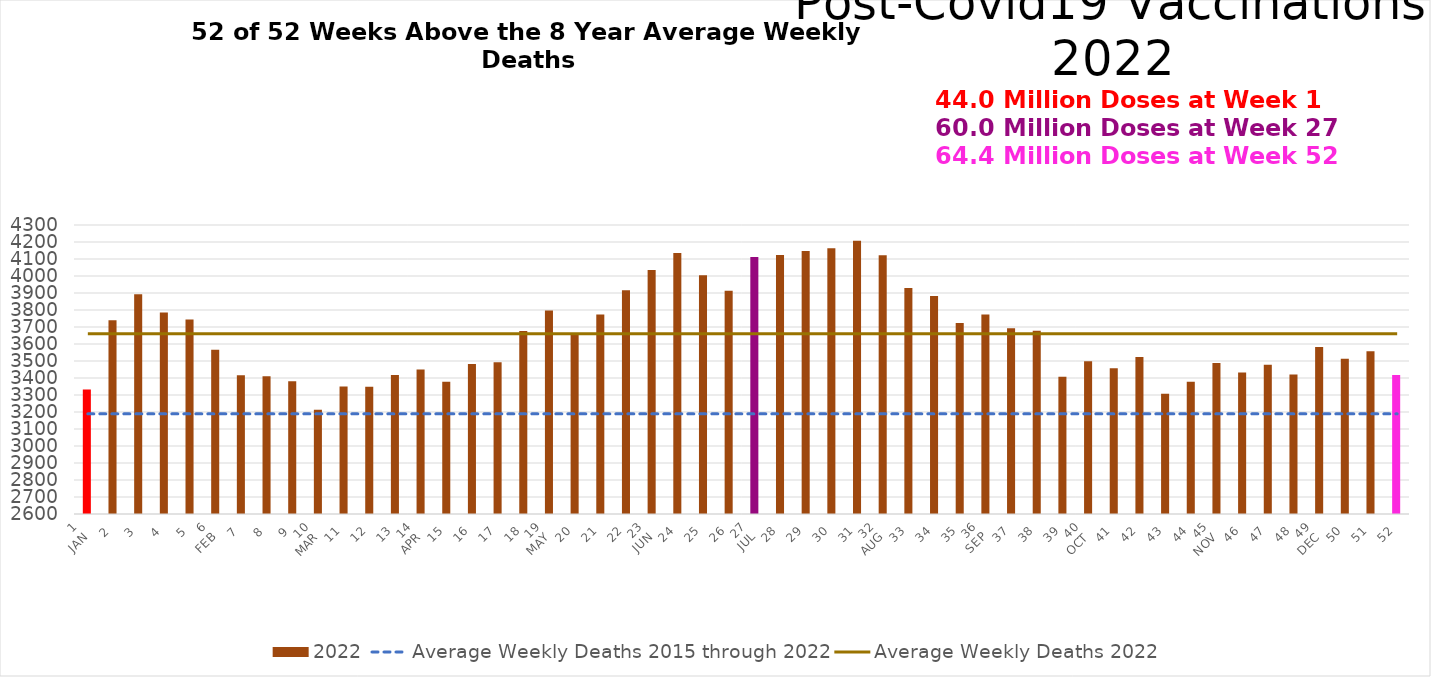
| Category | 2022 |
|---|---|
| 1
JAN | 3333 |
| 2 | 3739 |
| 3 | 3892 |
| 4 | 3786 |
| 5 | 3744 |
| 6
FEB | 3566 |
| 7 | 3416 |
| 8 | 3411 |
| 9 | 3381 |
| 10
MAR | 3213 |
| 11 | 3350 |
| 12 | 3348 |
| 13 | 3418 |
| 14
APR | 3450 |
| 15 | 3378 |
| 16 | 3483 |
| 17 | 3493 |
| 18 | 3677 |
| 19
MAY | 3797 |
| 20 | 3656 |
| 21 | 3773 |
| 22 | 3916 |
| 23
JUN | 4036 |
| 24 | 4136 |
| 25 | 4004 |
| 26 | 3913 |
| 27
JUL | 4112 |
| 28 | 4124 |
| 29 | 4147 |
| 30 | 4163 |
| 31 | 4208 |
| 32
AUG | 4122 |
| 33 | 3930 |
| 34 | 3882 |
| 35 | 3724 |
| 36
SEP | 3774 |
| 37 | 3692 |
| 38 | 3678 |
| 39 | 3407 |
| 40
OCT | 3499 |
| 41 | 3457 |
| 42 | 3524 |
| 43 | 3308 |
| 44 | 3378 |
| 45
NOV | 3488 |
| 46 | 3433 |
| 47 | 3478 |
| 48 | 3420 |
| 49
DEC | 3582 |
| 50 | 3513 |
| 51 | 3557 |
| 52 | 3417 |